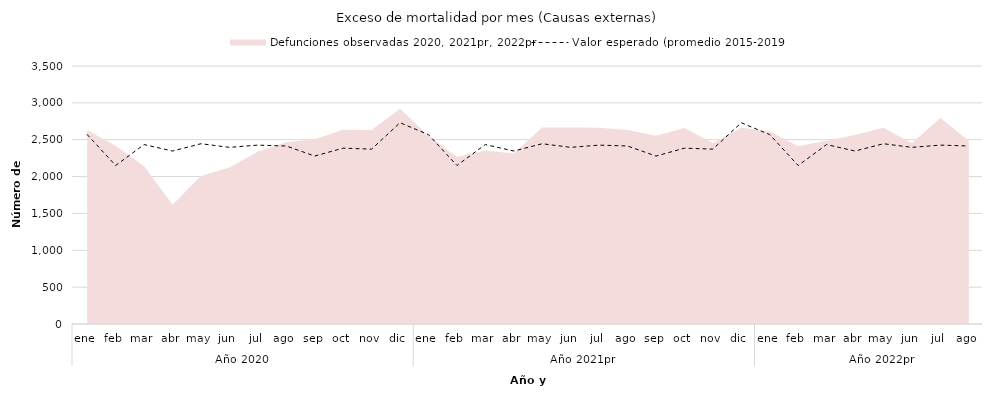
| Category | Valor esperado (promedio 2015-2019) |
|---|---|
| 0 | 2569.2 |
| 1 | 2150.4 |
| 2 | 2434.2 |
| 3 | 2346.4 |
| 4 | 2445.6 |
| 5 | 2396.4 |
| 6 | 2426.6 |
| 7 | 2414.8 |
| 8 | 2278.2 |
| 9 | 2385.4 |
| 10 | 2372.2 |
| 11 | 2730.2 |
| 12 | 2569.2 |
| 13 | 2150.4 |
| 14 | 2434.2 |
| 15 | 2346.4 |
| 16 | 2445.6 |
| 17 | 2396.4 |
| 18 | 2426.6 |
| 19 | 2414.8 |
| 20 | 2278.2 |
| 21 | 2385.4 |
| 22 | 2372.2 |
| 23 | 2730.2 |
| 24 | 2569.2 |
| 25 | 2150.4 |
| 26 | 2434.2 |
| 27 | 2346.4 |
| 28 | 2445.6 |
| 29 | 2396.4 |
| 30 | 2426.6 |
| 31 | 2414.8 |